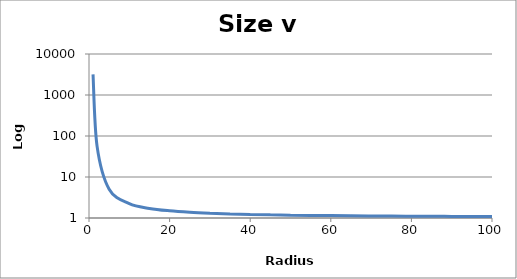
| Category | S/S0 |
|---|---|
| 1.0 | 3196.179 |
| 2.0 | 56.535 |
| 5.0 | 5.023 |
| 10.0 | 2.241 |
| 15.0 | 1.713 |
| 20.0 | 1.497 |
| 25.0 | 1.381 |
| 30.0 | 1.309 |
| 35.0 | 1.259 |
| 40.0 | 1.224 |
| 45.0 | 1.196 |
| 50.0 | 1.175 |
| 55.0 | 1.158 |
| 60.0 | 1.144 |
| 65.0 | 1.132 |
| 70.0 | 1.122 |
| 75.0 | 1.114 |
| 80.0 | 1.106 |
| 85.0 | 1.1 |
| 90.0 | 1.094 |
| 95.0 | 1.089 |
| 100.0 | 1.084 |